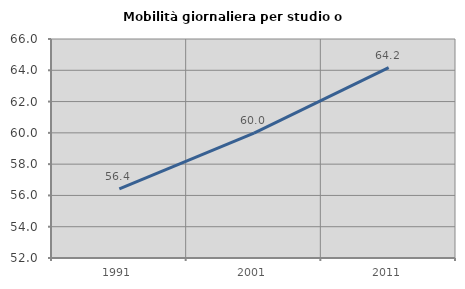
| Category | Mobilità giornaliera per studio o lavoro |
|---|---|
| 1991.0 | 56.415 |
| 2001.0 | 59.983 |
| 2011.0 | 64.167 |